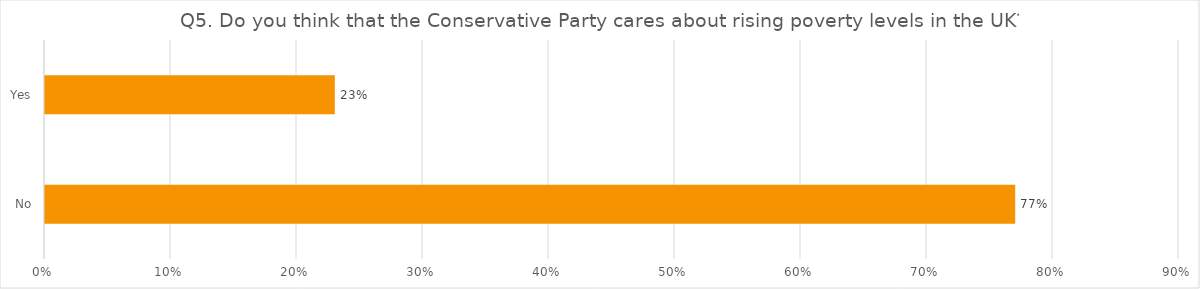
| Category | Q5. Do you think that the Conservative Party cares about rising poverty levels in the UK? |
|---|---|
| No | 0.77 |
| Yes | 0.23 |